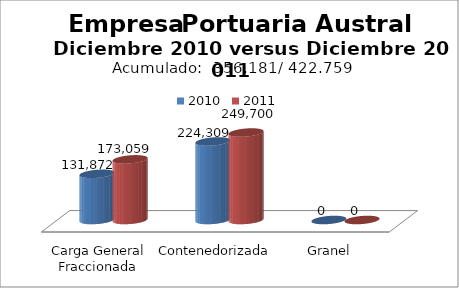
| Category | 2010 | 2011 |
|---|---|---|
| Carga General Fraccionada | 131871.6 | 173059 |
| Contenedorizada | 224309 | 249700 |
| Granel | 0 | 0 |